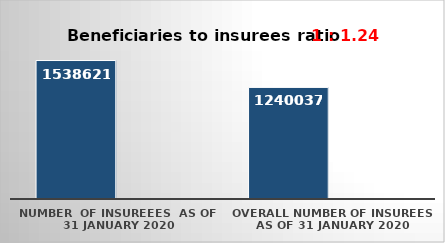
| Category | Series 0 | Series 1 |
|---|---|---|
| NUMBER  of insureees  as of  31 January 2020 | 1538621 |  |
| OVERALL number of insurees as of 31 January 2020 | 1240037 |  |